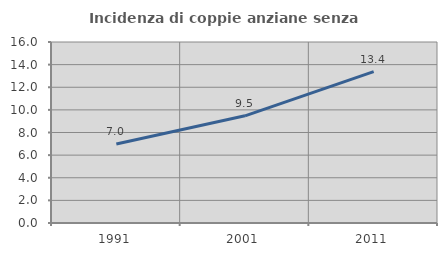
| Category | Incidenza di coppie anziane senza figli  |
|---|---|
| 1991.0 | 6.985 |
| 2001.0 | 9.476 |
| 2011.0 | 13.382 |